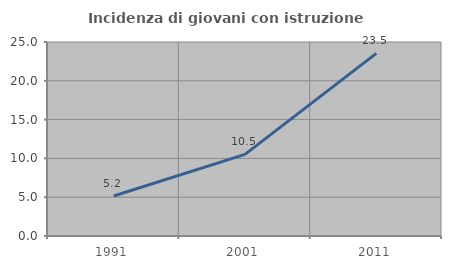
| Category | Incidenza di giovani con istruzione universitaria |
|---|---|
| 1991.0 | 5.155 |
| 2001.0 | 10.526 |
| 2011.0 | 23.529 |